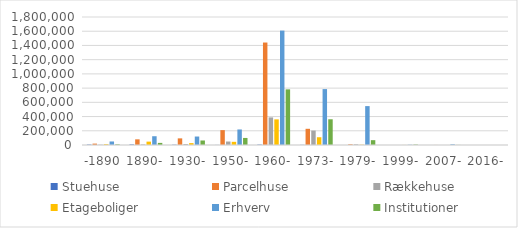
| Category | Stuehuse | Parcelhuse | Rækkehuse | Etageboliger | Erhverv | Institutioner |
|---|---|---|---|---|---|---|
| -1890 | 6257.709 | 19503.285 | 4082.128 | 11121.709 | 49557.91 | 9224.144 |
| 1890- | 8575.744 | 79636.953 | 7928.584 | 47463.972 | 123387.997 | 29569.397 |
| 1930- | 4131.421 | 93242.993 | 14367.64 | 26490.618 | 119129.161 | 63504.832 |
| 1950- | 1139.329 | 209277.893 | 48916.2 | 44764.066 | 218364.503 | 99183.147 |
| 1960- | 5919.382 | 1440959.864 | 388057.628 | 360467.661 | 1609108.718 | 782353.494 |
| 1973- | 2189.755 | 227838.965 | 202886.113 | 109152.928 | 786145.84 | 361885.311 |
| 1979- | 0 | 9888.753 | 9666.325 | 3820.022 | 547018.985 | 67994.799 |
| 1999- | 0 | 167.085 | 72.583 | 639.406 | 3592.912 | 5897.739 |
| 2007- | 0 | 618.407 | 0 | 59.582 | 9543.039 | 1261.273 |
| 2016- | 0 | 0 | 0 | 0 | 0 | 0 |